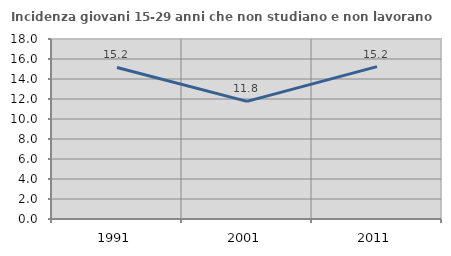
| Category | Incidenza giovani 15-29 anni che non studiano e non lavorano  |
|---|---|
| 1991.0 | 15.156 |
| 2001.0 | 11.765 |
| 2011.0 | 15.238 |